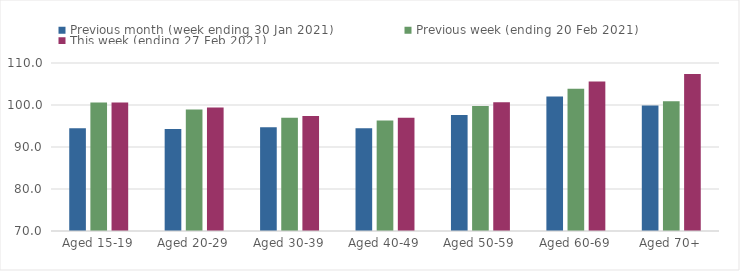
| Category | Previous month (week ending 30 Jan 2021) | Previous week (ending 20 Feb 2021) | This week (ending 27 Feb 2021) |
|---|---|---|---|
| Aged 15-19 | 94.47 | 100.62 | 100.59 |
| Aged 20-29 | 94.31 | 98.92 | 99.43 |
| Aged 30-39 | 94.72 | 96.96 | 97.37 |
| Aged 40-49 | 94.44 | 96.32 | 96.96 |
| Aged 50-59 | 97.6 | 99.75 | 100.65 |
| Aged 60-69 | 102.05 | 103.85 | 105.59 |
| Aged 70+ | 99.91 | 100.9 | 107.37 |